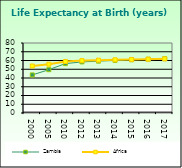
| Category | Zambia | Africa                        |
|---|---|---|
| 2000.0 | 43.515 | 53.721 |
| 2005.0 | 49.494 | 55.757 |
| 2010.0 | 56.437 | 58.857 |
| 2012.0 | 58.409 | 59.91 |
| 2013.0 | 59.279 | 60.376 |
| 2014.0 | 60.084 | 60.801 |
| 2015.0 | 60.819 | 61.187 |
| 2016.0 | 61.473 | 61.538 |
| 2017.0 | 62.04 | 61.865 |